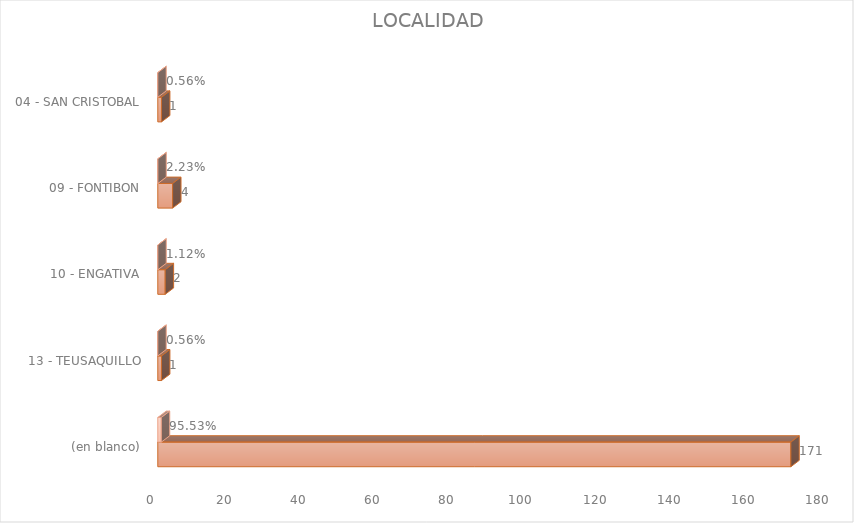
| Category | Cuenta de Número petición | Cuenta de Número petición2 |
|---|---|---|
| (en blanco) | 171 | 0.955 |
| 13 - TEUSAQUILLO | 1 | 0.006 |
| 10 - ENGATIVA | 2 | 0.011 |
| 09 - FONTIBON | 4 | 0.022 |
| 04 - SAN CRISTOBAL | 1 | 0.006 |